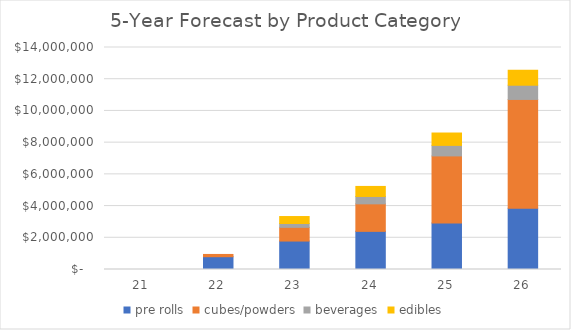
| Category | pre rolls | cubes/powders | beverages | edibles |
|---|---|---|---|---|
| 21.0 | 0 | 0 | 0 | 0 |
| 22.0 | 806000 | 143000 | 0 | 0 |
| 23.0 | 1794000 | 864500 | 242233.333 | 439833.333 |
| 24.0 | 2405000 | 1735500 | 465454.167 | 632666.667 |
| 25.0 | 2938000 | 4225000 | 664029.167 | 780000 |
| 26.0 | 3867500 | 6857500 | 895700 | 944666.667 |